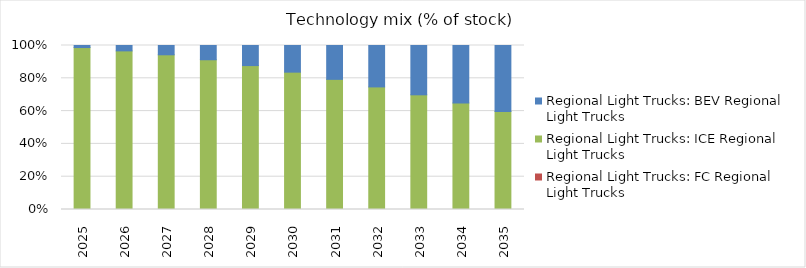
| Category | Regional Light Trucks: FC Regional Light Trucks | Regional Light Trucks: ICE Regional Light Trucks | Regional Light Trucks: BEV Regional Light Trucks |
|---|---|---|---|
| 2025.0 | 0 | 0.988 | 0.012 |
| 2026.0 | 0 | 0.967 | 0.033 |
| 2027.0 | 0 | 0.943 | 0.057 |
| 2028.0 | 0 | 0.913 | 0.087 |
| 2029.0 | 0 | 0.878 | 0.122 |
| 2030.0 | 0 | 0.837 | 0.163 |
| 2031.0 | 0 | 0.794 | 0.206 |
| 2032.0 | 0 | 0.747 | 0.253 |
| 2033.0 | 0 | 0.699 | 0.301 |
| 2034.0 | 0 | 0.649 | 0.351 |
| 2035.0 | 0 | 0.598 | 0.402 |